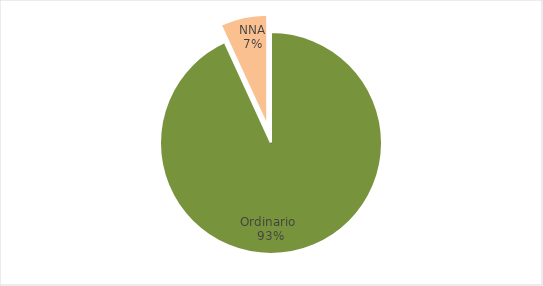
| Category | Series 0 |
|---|---|
| Ordinario  | 4765 |
| NNA | 351 |